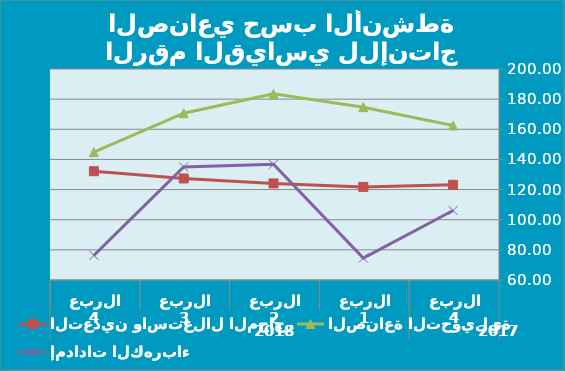
| Category | التعدين واستغلال المحاجر | الصناعة التحويلية | إمدادات الكهرباء |
|---|---|---|---|
| 0 | 123.18 | 162.54 | 106.12 |
| 1 | 121.76 | 174.682 | 74.56 |
| 2 | 124.06 | 183.53 | 136.79 |
| 3 | 127.38 | 170.7 | 134.96 |
| 4 | 132.18 | 144.85 | 76.31 |